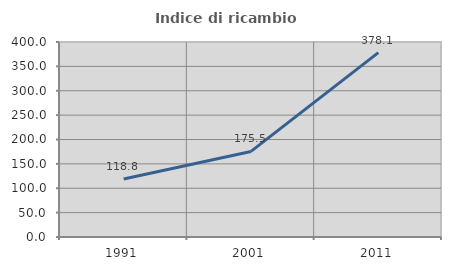
| Category | Indice di ricambio occupazionale  |
|---|---|
| 1991.0 | 118.826 |
| 2001.0 | 175.523 |
| 2011.0 | 378.119 |